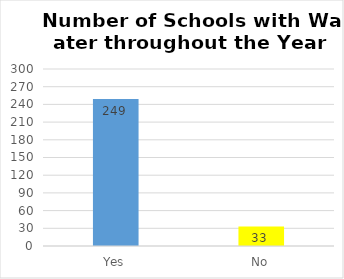
| Category | Series 0 |
|---|---|
| Yes | 249 |
| No | 33 |